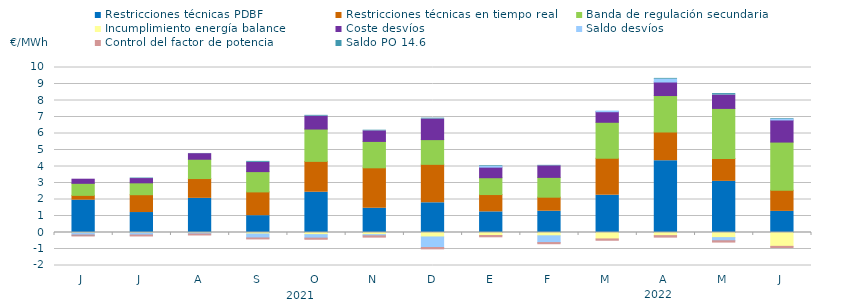
| Category | Restricciones técnicas PDBF | Restricciones técnicas en tiempo real | Banda de regulación secundaria | Incumplimiento energía balance | Coste desvíos | Saldo desvíos | Control del factor de potencia | Saldo PO 14.6 |
|---|---|---|---|---|---|---|---|---|
| J | 1.96 | 0.29 | 0.73 | -0.03 | 0.25 | -0.12 | -0.06 | -0.01 |
| J | 1.21 | 1.08 | 0.72 | -0.03 | 0.26 | -0.12 | -0.06 | 0.03 |
| A | 2.07 | 1.2 | 1.17 | -0.03 | 0.34 | -0.06 | -0.06 | 0.01 |
| S | 1.02 | 1.44 | 1.23 | -0.09 | 0.56 | -0.24 | -0.06 | 0.06 |
| O | 2.44 | 1.87 | 1.96 | -0.13 | 0.78 | -0.21 | -0.07 | 0.05 |
| N | 1.47 | 2.45 | 1.6 | -0.13 | 0.64 | -0.07 | -0.08 | 0.04 |
| D | 1.8 | 2.33 | 1.5 | -0.27 | 1.25 | -0.64 | -0.08 | 0.05 |
| E | 1.25 | 1.05 | 1.02 | -0.18 | 0.64 | 0.04 | -0.08 | 0.04 |
| F | 1.29 | 0.85 | 1.2 | -0.2 | 0.7 | -0.41 | -0.07 | 0.03 |
| M | 2.26 | 2.24 | 2.18 | -0.39 | 0.64 | 0.04 | -0.08 | 0 |
| A | 4.35 | 1.74 | 2.21 | -0.19 | 0.82 | 0.17 | -0.09 | 0.05 |
| M | 3.1 | 1.39 | 3.03 | -0.31 | 0.81 | -0.19 | -0.08 | 0.09 |
| J | 1.28 | 1.28 | 2.92 | -0.84 | 1.34 | 0.05 | -0.07 | 0.04 |